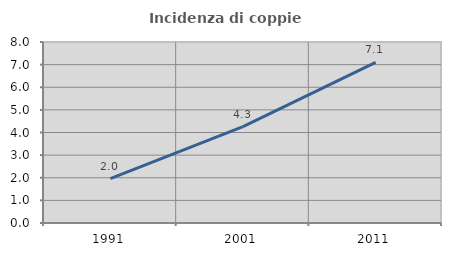
| Category | Incidenza di coppie miste |
|---|---|
| 1991.0 | 1.964 |
| 2001.0 | 4.26 |
| 2011.0 | 7.095 |